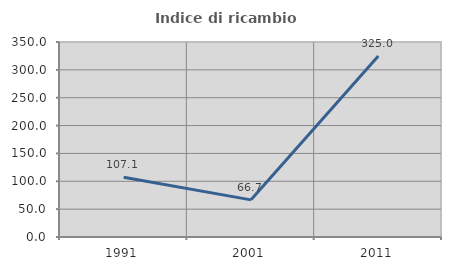
| Category | Indice di ricambio occupazionale  |
|---|---|
| 1991.0 | 107.143 |
| 2001.0 | 66.667 |
| 2011.0 | 325 |